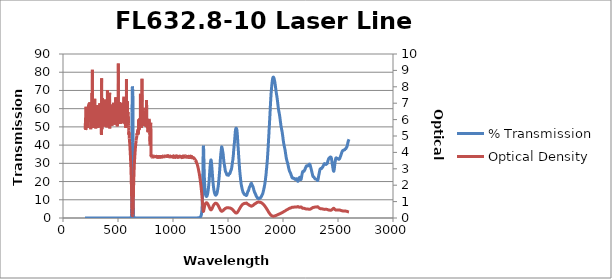
| Category | % Transmission |
|---|---|
| 2600.0 | 43.196 |
| 2599.0 | 43.062 |
| 2598.0 | 42.871 |
| 2597.0 | 42.738 |
| 2596.0 | 42.614 |
| 2595.0 | 42.464 |
| 2594.0 | 42.283 |
| 2593.0 | 42.076 |
| 2592.0 | 41.834 |
| 2591.0 | 41.621 |
| 2590.0 | 41.349 |
| 2589.0 | 41.074 |
| 2588.0 | 40.827 |
| 2587.0 | 40.534 |
| 2586.0 | 40.253 |
| 2585.0 | 40 |
| 2584.0 | 39.734 |
| 2583.0 | 39.489 |
| 2582.0 | 39.278 |
| 2581.0 | 39.092 |
| 2580.0 | 38.997 |
| 2579.0 | 38.913 |
| 2578.0 | 38.8 |
| 2577.0 | 38.715 |
| 2576.0 | 38.593 |
| 2575.0 | 38.463 |
| 2574.0 | 38.34 |
| 2573.0 | 38.215 |
| 2572.0 | 38.123 |
| 2571.0 | 38.048 |
| 2570.0 | 37.995 |
| 2569.0 | 37.967 |
| 2568.0 | 37.96 |
| 2567.0 | 37.935 |
| 2566.0 | 37.918 |
| 2565.0 | 37.865 |
| 2564.0 | 37.772 |
| 2563.0 | 37.67 |
| 2562.0 | 37.567 |
| 2561.0 | 37.487 |
| 2560.0 | 37.415 |
| 2559.0 | 37.37 |
| 2558.0 | 37.332 |
| 2557.0 | 37.343 |
| 2556.0 | 37.321 |
| 2555.0 | 37.329 |
| 2554.0 | 37.312 |
| 2553.0 | 37.299 |
| 2552.0 | 37.284 |
| 2551.0 | 37.246 |
| 2550.0 | 37.211 |
| 2549.0 | 37.189 |
| 2548.0 | 37.184 |
| 2547.0 | 37.151 |
| 2546.0 | 37.129 |
| 2545.0 | 37.092 |
| 2544.0 | 37.058 |
| 2543.0 | 36.993 |
| 2542.0 | 36.908 |
| 2541.0 | 36.813 |
| 2540.0 | 36.694 |
| 2539.0 | 36.596 |
| 2538.0 | 36.502 |
| 2537.0 | 36.373 |
| 2536.0 | 36.249 |
| 2535.0 | 36.068 |
| 2534.0 | 35.871 |
| 2533.0 | 35.688 |
| 2532.0 | 35.474 |
| 2531.0 | 35.268 |
| 2530.0 | 35.095 |
| 2529.0 | 34.899 |
| 2528.0 | 34.746 |
| 2527.0 | 34.568 |
| 2526.0 | 34.393 |
| 2525.0 | 34.243 |
| 2524.0 | 34.048 |
| 2523.0 | 33.882 |
| 2522.0 | 33.734 |
| 2521.0 | 33.534 |
| 2520.0 | 33.408 |
| 2519.0 | 33.234 |
| 2518.0 | 33.073 |
| 2517.0 | 32.934 |
| 2516.0 | 32.772 |
| 2515.0 | 32.644 |
| 2514.0 | 32.543 |
| 2513.0 | 32.422 |
| 2512.0 | 32.371 |
| 2511.0 | 32.304 |
| 2510.0 | 32.247 |
| 2509.0 | 32.237 |
| 2508.0 | 32.19 |
| 2507.0 | 32.21 |
| 2506.0 | 32.218 |
| 2505.0 | 32.236 |
| 2504.0 | 32.28 |
| 2503.0 | 32.328 |
| 2502.0 | 32.359 |
| 2501.0 | 32.434 |
| 2500.0 | 32.435 |
| 2499.0 | 32.491 |
| 2498.0 | 32.507 |
| 2497.0 | 32.533 |
| 2496.0 | 32.578 |
| 2495.0 | 32.613 |
| 2494.0 | 32.654 |
| 2493.0 | 32.691 |
| 2492.0 | 32.719 |
| 2491.0 | 32.747 |
| 2490.0 | 32.769 |
| 2489.0 | 32.781 |
| 2488.0 | 32.837 |
| 2487.0 | 32.855 |
| 2486.0 | 32.926 |
| 2485.0 | 32.957 |
| 2484.0 | 33.014 |
| 2483.0 | 33.01 |
| 2482.0 | 32.996 |
| 2481.0 | 32.885 |
| 2480.0 | 32.754 |
| 2479.0 | 32.525 |
| 2478.0 | 32.274 |
| 2477.0 | 31.943 |
| 2476.0 | 31.597 |
| 2475.0 | 31.193 |
| 2474.0 | 30.804 |
| 2473.0 | 30.342 |
| 2472.0 | 29.88 |
| 2471.0 | 29.401 |
| 2470.0 | 28.882 |
| 2469.0 | 28.362 |
| 2468.0 | 27.849 |
| 2467.0 | 27.336 |
| 2466.0 | 26.858 |
| 2465.0 | 26.414 |
| 2464.0 | 26.071 |
| 2463.0 | 25.813 |
| 2462.0 | 25.662 |
| 2461.0 | 25.64 |
| 2460.0 | 25.669 |
| 2459.0 | 25.833 |
| 2458.0 | 26.017 |
| 2457.0 | 26.288 |
| 2456.0 | 26.597 |
| 2455.0 | 26.916 |
| 2454.0 | 27.277 |
| 2453.0 | 27.662 |
| 2452.0 | 28.039 |
| 2451.0 | 28.485 |
| 2450.0 | 28.875 |
| 2449.0 | 29.315 |
| 2448.0 | 29.702 |
| 2447.0 | 30.103 |
| 2446.0 | 30.534 |
| 2445.0 | 30.915 |
| 2444.0 | 31.353 |
| 2443.0 | 31.757 |
| 2442.0 | 32.106 |
| 2441.0 | 32.478 |
| 2440.0 | 32.734 |
| 2439.0 | 33.008 |
| 2438.0 | 33.171 |
| 2437.0 | 33.288 |
| 2436.0 | 33.381 |
| 2435.0 | 33.381 |
| 2434.0 | 33.423 |
| 2433.0 | 33.407 |
| 2432.0 | 33.399 |
| 2431.0 | 33.435 |
| 2430.0 | 33.399 |
| 2429.0 | 33.436 |
| 2428.0 | 33.389 |
| 2427.0 | 33.337 |
| 2426.0 | 33.292 |
| 2425.0 | 33.157 |
| 2424.0 | 33.112 |
| 2423.0 | 33.009 |
| 2422.0 | 32.968 |
| 2421.0 | 32.957 |
| 2420.0 | 32.899 |
| 2419.0 | 32.913 |
| 2418.0 | 32.832 |
| 2417.0 | 32.769 |
| 2416.0 | 32.671 |
| 2415.0 | 32.508 |
| 2414.0 | 32.391 |
| 2413.0 | 32.201 |
| 2412.0 | 32.061 |
| 2411.0 | 31.887 |
| 2410.0 | 31.697 |
| 2409.0 | 31.536 |
| 2408.0 | 31.283 |
| 2407.0 | 31.071 |
| 2406.0 | 30.8 |
| 2405.0 | 30.542 |
| 2404.0 | 30.321 |
| 2403.0 | 30.097 |
| 2402.0 | 29.972 |
| 2401.0 | 29.843 |
| 2400.0 | 29.788 |
| 2399.0 | 29.755 |
| 2398.0 | 29.719 |
| 2397.0 | 29.706 |
| 2396.0 | 29.641 |
| 2395.0 | 29.604 |
| 2394.0 | 29.52 |
| 2393.0 | 29.452 |
| 2392.0 | 29.416 |
| 2391.0 | 29.38 |
| 2390.0 | 29.417 |
| 2389.0 | 29.428 |
| 2388.0 | 29.49 |
| 2387.0 | 29.517 |
| 2386.0 | 29.56 |
| 2385.0 | 29.581 |
| 2384.0 | 29.592 |
| 2383.0 | 29.625 |
| 2382.0 | 29.669 |
| 2381.0 | 29.701 |
| 2380.0 | 29.787 |
| 2379.0 | 29.805 |
| 2378.0 | 29.863 |
| 2377.0 | 29.821 |
| 2376.0 | 29.809 |
| 2375.0 | 29.698 |
| 2374.0 | 29.609 |
| 2373.0 | 29.476 |
| 2372.0 | 29.351 |
| 2371.0 | 29.244 |
| 2370.0 | 29.128 |
| 2369.0 | 29.036 |
| 2368.0 | 28.912 |
| 2367.0 | 28.8 |
| 2366.0 | 28.637 |
| 2365.0 | 28.501 |
| 2364.0 | 28.335 |
| 2363.0 | 28.212 |
| 2362.0 | 28.076 |
| 2361.0 | 28.018 |
| 2360.0 | 27.921 |
| 2359.0 | 27.912 |
| 2358.0 | 27.835 |
| 2357.0 | 27.807 |
| 2356.0 | 27.693 |
| 2355.0 | 27.605 |
| 2354.0 | 27.458 |
| 2353.0 | 27.33 |
| 2352.0 | 27.233 |
| 2351.0 | 27.151 |
| 2350.0 | 27.147 |
| 2349.0 | 27.13 |
| 2348.0 | 27.199 |
| 2347.0 | 27.201 |
| 2346.0 | 27.257 |
| 2345.0 | 27.223 |
| 2344.0 | 27.23 |
| 2343.0 | 27.173 |
| 2342.0 | 27.14 |
| 2341.0 | 27.094 |
| 2340.0 | 27.034 |
| 2339.0 | 26.979 |
| 2338.0 | 26.864 |
| 2337.0 | 26.74 |
| 2336.0 | 26.536 |
| 2335.0 | 26.309 |
| 2334.0 | 26.009 |
| 2333.0 | 25.711 |
| 2332.0 | 25.406 |
| 2331.0 | 25.111 |
| 2330.0 | 24.824 |
| 2329.0 | 24.562 |
| 2328.0 | 24.274 |
| 2327.0 | 23.987 |
| 2326.0 | 23.677 |
| 2325.0 | 23.348 |
| 2324.0 | 22.983 |
| 2323.0 | 22.636 |
| 2322.0 | 22.263 |
| 2321.0 | 21.916 |
| 2320.0 | 21.59 |
| 2319.0 | 21.297 |
| 2318.0 | 21.052 |
| 2317.0 | 20.821 |
| 2316.0 | 20.683 |
| 2315.0 | 20.557 |
| 2314.0 | 20.542 |
| 2313.0 | 20.569 |
| 2312.0 | 20.658 |
| 2311.0 | 20.79 |
| 2310.0 | 20.919 |
| 2309.0 | 21.066 |
| 2308.0 | 21.164 |
| 2307.0 | 21.247 |
| 2306.0 | 21.28 |
| 2305.0 | 21.297 |
| 2304.0 | 21.307 |
| 2303.0 | 21.292 |
| 2302.0 | 21.314 |
| 2301.0 | 21.308 |
| 2300.0 | 21.325 |
| 2299.0 | 21.331 |
| 2298.0 | 21.338 |
| 2297.0 | 21.357 |
| 2296.0 | 21.355 |
| 2295.0 | 21.398 |
| 2294.0 | 21.409 |
| 2293.0 | 21.464 |
| 2292.0 | 21.498 |
| 2291.0 | 21.554 |
| 2290.0 | 21.618 |
| 2289.0 | 21.671 |
| 2288.0 | 21.757 |
| 2287.0 | 21.832 |
| 2286.0 | 21.932 |
| 2285.0 | 22.035 |
| 2284.0 | 22.14 |
| 2283.0 | 22.248 |
| 2282.0 | 22.34 |
| 2281.0 | 22.418 |
| 2280.0 | 22.478 |
| 2279.0 | 22.528 |
| 2278.0 | 22.56 |
| 2277.0 | 22.593 |
| 2276.0 | 22.622 |
| 2275.0 | 22.653 |
| 2274.0 | 22.715 |
| 2273.0 | 22.791 |
| 2272.0 | 22.926 |
| 2271.0 | 23.082 |
| 2270.0 | 23.309 |
| 2269.0 | 23.549 |
| 2268.0 | 23.804 |
| 2267.0 | 24.076 |
| 2266.0 | 24.323 |
| 2265.0 | 24.592 |
| 2264.0 | 24.837 |
| 2263.0 | 25.114 |
| 2262.0 | 25.366 |
| 2261.0 | 25.626 |
| 2260.0 | 25.869 |
| 2259.0 | 26.122 |
| 2258.0 | 26.363 |
| 2257.0 | 26.611 |
| 2256.0 | 26.864 |
| 2255.0 | 27.109 |
| 2254.0 | 27.366 |
| 2253.0 | 27.623 |
| 2252.0 | 27.87 |
| 2251.0 | 28.135 |
| 2250.0 | 28.373 |
| 2249.0 | 28.607 |
| 2248.0 | 28.799 |
| 2247.0 | 28.995 |
| 2246.0 | 29.149 |
| 2245.0 | 29.287 |
| 2244.0 | 29.401 |
| 2243.0 | 29.488 |
| 2242.0 | 29.549 |
| 2241.0 | 29.575 |
| 2240.0 | 29.576 |
| 2239.0 | 29.542 |
| 2238.0 | 29.497 |
| 2237.0 | 29.4 |
| 2236.0 | 29.324 |
| 2235.0 | 29.195 |
| 2234.0 | 29.111 |
| 2233.0 | 28.984 |
| 2232.0 | 28.919 |
| 2231.0 | 28.828 |
| 2230.0 | 28.786 |
| 2229.0 | 28.725 |
| 2228.0 | 28.691 |
| 2227.0 | 28.634 |
| 2226.0 | 28.622 |
| 2225.0 | 28.593 |
| 2224.0 | 28.625 |
| 2223.0 | 28.647 |
| 2222.0 | 28.686 |
| 2221.0 | 28.726 |
| 2220.0 | 28.71 |
| 2219.0 | 28.723 |
| 2218.0 | 28.665 |
| 2217.0 | 28.654 |
| 2216.0 | 28.621 |
| 2215.0 | 28.612 |
| 2214.0 | 28.59 |
| 2213.0 | 28.571 |
| 2212.0 | 28.479 |
| 2211.0 | 28.406 |
| 2210.0 | 28.23 |
| 2209.0 | 28.116 |
| 2208.0 | 27.927 |
| 2207.0 | 27.82 |
| 2206.0 | 27.685 |
| 2205.0 | 27.58 |
| 2204.0 | 27.443 |
| 2203.0 | 27.297 |
| 2202.0 | 27.085 |
| 2201.0 | 26.897 |
| 2200.0 | 26.669 |
| 2199.0 | 26.538 |
| 2198.0 | 26.413 |
| 2197.0 | 26.357 |
| 2196.0 | 26.292 |
| 2195.0 | 26.189 |
| 2194.0 | 26.062 |
| 2193.0 | 25.908 |
| 2192.0 | 25.749 |
| 2191.0 | 25.696 |
| 2190.0 | 25.654 |
| 2189.0 | 25.709 |
| 2188.0 | 25.762 |
| 2187.0 | 25.785 |
| 2186.0 | 25.786 |
| 2185.0 | 25.736 |
| 2184.0 | 25.668 |
| 2183.0 | 25.643 |
| 2182.0 | 25.58 |
| 2181.0 | 25.569 |
| 2180.0 | 25.502 |
| 2179.0 | 25.407 |
| 2178.0 | 25.252 |
| 2177.0 | 25.058 |
| 2176.0 | 24.812 |
| 2175.0 | 24.565 |
| 2174.0 | 24.279 |
| 2173.0 | 23.999 |
| 2172.0 | 23.684 |
| 2171.0 | 23.356 |
| 2170.0 | 22.988 |
| 2169.0 | 22.603 |
| 2168.0 | 22.216 |
| 2167.0 | 21.86 |
| 2166.0 | 21.539 |
| 2165.0 | 21.339 |
| 2164.0 | 21.18 |
| 2163.0 | 21.123 |
| 2162.0 | 21.094 |
| 2161.0 | 21.147 |
| 2160.0 | 21.216 |
| 2159.0 | 21.37 |
| 2158.0 | 21.515 |
| 2157.0 | 21.732 |
| 2156.0 | 21.894 |
| 2155.0 | 22.086 |
| 2154.0 | 22.183 |
| 2153.0 | 22.291 |
| 2152.0 | 22.287 |
| 2151.0 | 22.322 |
| 2150.0 | 22.255 |
| 2149.0 | 22.241 |
| 2148.0 | 22.12 |
| 2147.0 | 22.041 |
| 2146.0 | 21.848 |
| 2145.0 | 21.685 |
| 2144.0 | 21.424 |
| 2143.0 | 21.216 |
| 2142.0 | 20.965 |
| 2141.0 | 20.78 |
| 2140.0 | 20.583 |
| 2139.0 | 20.467 |
| 2138.0 | 20.298 |
| 2137.0 | 20.208 |
| 2136.0 | 20.117 |
| 2135.0 | 20.124 |
| 2134.0 | 20.193 |
| 2133.0 | 20.333 |
| 2132.0 | 20.518 |
| 2131.0 | 20.718 |
| 2130.0 | 20.899 |
| 2129.0 | 21.045 |
| 2128.0 | 21.2 |
| 2127.0 | 21.283 |
| 2126.0 | 21.418 |
| 2125.0 | 21.462 |
| 2124.0 | 21.562 |
| 2123.0 | 21.546 |
| 2122.0 | 21.574 |
| 2121.0 | 21.484 |
| 2120.0 | 21.467 |
| 2119.0 | 21.38 |
| 2118.0 | 21.372 |
| 2117.0 | 21.332 |
| 2116.0 | 21.349 |
| 2115.0 | 21.304 |
| 2114.0 | 21.281 |
| 2113.0 | 21.219 |
| 2112.0 | 21.167 |
| 2111.0 | 21.159 |
| 2110.0 | 21.164 |
| 2109.0 | 21.249 |
| 2108.0 | 21.29 |
| 2107.0 | 21.371 |
| 2106.0 | 21.366 |
| 2105.0 | 21.431 |
| 2104.0 | 21.424 |
| 2103.0 | 21.526 |
| 2102.0 | 21.592 |
| 2101.0 | 21.712 |
| 2100.0 | 21.758 |
| 2099.0 | 21.825 |
| 2098.0 | 21.828 |
| 2097.0 | 21.823 |
| 2096.0 | 21.853 |
| 2095.0 | 21.843 |
| 2094.0 | 21.917 |
| 2093.0 | 21.914 |
| 2092.0 | 21.972 |
| 2091.0 | 21.917 |
| 2090.0 | 21.926 |
| 2089.0 | 21.868 |
| 2088.0 | 21.884 |
| 2087.0 | 21.926 |
| 2086.0 | 22.007 |
| 2085.0 | 22.091 |
| 2084.0 | 22.157 |
| 2083.0 | 22.235 |
| 2082.0 | 22.263 |
| 2081.0 | 22.401 |
| 2080.0 | 22.522 |
| 2079.0 | 22.754 |
| 2078.0 | 22.918 |
| 2077.0 | 23.148 |
| 2076.0 | 23.286 |
| 2075.0 | 23.429 |
| 2074.0 | 23.6 |
| 2073.0 | 23.75 |
| 2072.0 | 23.995 |
| 2071.0 | 24.162 |
| 2070.0 | 24.401 |
| 2069.0 | 24.5 |
| 2068.0 | 24.647 |
| 2067.0 | 24.717 |
| 2066.0 | 24.827 |
| 2065.0 | 24.97 |
| 2064.0 | 25.109 |
| 2063.0 | 25.296 |
| 2062.0 | 25.391 |
| 2061.0 | 25.536 |
| 2060.0 | 25.587 |
| 2059.0 | 25.736 |
| 2058.0 | 25.905 |
| 2057.0 | 26.137 |
| 2056.0 | 26.395 |
| 2055.0 | 26.623 |
| 2054.0 | 26.859 |
| 2053.0 | 27.026 |
| 2052.0 | 27.295 |
| 2051.0 | 27.549 |
| 2050.0 | 27.904 |
| 2049.0 | 28.221 |
| 2048.0 | 28.548 |
| 2047.0 | 28.822 |
| 2046.0 | 29.024 |
| 2045.0 | 29.308 |
| 2044.0 | 29.52 |
| 2043.0 | 29.818 |
| 2042.0 | 30.071 |
| 2041.0 | 30.336 |
| 2040.0 | 30.542 |
| 2039.0 | 30.686 |
| 2038.0 | 30.894 |
| 2037.0 | 31.032 |
| 2036.0 | 31.293 |
| 2035.0 | 31.54 |
| 2034.0 | 31.841 |
| 2033.0 | 32.082 |
| 2032.0 | 32.298 |
| 2031.0 | 32.584 |
| 2030.0 | 32.816 |
| 2029.0 | 33.208 |
| 2028.0 | 33.599 |
| 2027.0 | 34.037 |
| 2026.0 | 34.427 |
| 2025.0 | 34.773 |
| 2024.0 | 35.197 |
| 2023.0 | 35.516 |
| 2022.0 | 35.988 |
| 2021.0 | 36.409 |
| 2020.0 | 36.852 |
| 2019.0 | 37.226 |
| 2018.0 | 37.511 |
| 2017.0 | 37.835 |
| 2016.0 | 38.074 |
| 2015.0 | 38.393 |
| 2014.0 | 38.714 |
| 2013.0 | 39.024 |
| 2012.0 | 39.338 |
| 2011.0 | 39.526 |
| 2010.0 | 39.797 |
| 2009.0 | 40.044 |
| 2008.0 | 40.365 |
| 2007.0 | 40.767 |
| 2006.0 | 41.176 |
| 2005.0 | 41.609 |
| 2004.0 | 41.93 |
| 2003.0 | 42.333 |
| 2002.0 | 42.797 |
| 2001.0 | 43.263 |
| 2000.0 | 43.85 |
| 1999.0 | 44.327 |
| 1998.0 | 44.842 |
| 1997.0 | 45.228 |
| 1996.0 | 45.615 |
| 1995.0 | 46.07 |
| 1994.0 | 46.487 |
| 1993.0 | 46.952 |
| 1992.0 | 47.317 |
| 1991.0 | 47.645 |
| 1990.0 | 47.949 |
| 1989.0 | 48.158 |
| 1988.0 | 48.456 |
| 1987.0 | 48.803 |
| 1986.0 | 49.146 |
| 1985.0 | 49.481 |
| 1984.0 | 49.744 |
| 1983.0 | 50.068 |
| 1982.0 | 50.374 |
| 1981.0 | 50.77 |
| 1980.0 | 51.273 |
| 1979.0 | 51.774 |
| 1978.0 | 52.254 |
| 1977.0 | 52.682 |
| 1976.0 | 53.102 |
| 1975.0 | 53.605 |
| 1974.0 | 54.11 |
| 1973.0 | 54.637 |
| 1972.0 | 55.109 |
| 1971.0 | 55.529 |
| 1970.0 | 55.947 |
| 1969.0 | 56.246 |
| 1968.0 | 56.621 |
| 1967.0 | 57.015 |
| 1966.0 | 57.36 |
| 1965.0 | 57.714 |
| 1964.0 | 57.989 |
| 1963.0 | 58.282 |
| 1962.0 | 58.602 |
| 1961.0 | 58.93 |
| 1960.0 | 59.355 |
| 1959.0 | 59.774 |
| 1958.0 | 60.219 |
| 1957.0 | 60.659 |
| 1956.0 | 61.047 |
| 1955.0 | 61.54 |
| 1954.0 | 62.088 |
| 1953.0 | 62.621 |
| 1952.0 | 63.169 |
| 1951.0 | 63.66 |
| 1950.0 | 64.147 |
| 1949.0 | 64.641 |
| 1948.0 | 65.112 |
| 1947.0 | 65.58 |
| 1946.0 | 66.026 |
| 1945.0 | 66.444 |
| 1944.0 | 66.867 |
| 1943.0 | 67.21 |
| 1942.0 | 67.58 |
| 1941.0 | 67.956 |
| 1940.0 | 68.327 |
| 1939.0 | 68.747 |
| 1938.0 | 69.16 |
| 1937.0 | 69.582 |
| 1936.0 | 70.029 |
| 1935.0 | 70.479 |
| 1934.0 | 70.932 |
| 1933.0 | 71.402 |
| 1932.0 | 71.887 |
| 1931.0 | 72.374 |
| 1930.0 | 72.849 |
| 1929.0 | 73.3 |
| 1928.0 | 73.742 |
| 1927.0 | 74.136 |
| 1926.0 | 74.496 |
| 1925.0 | 74.834 |
| 1924.0 | 75.159 |
| 1923.0 | 75.459 |
| 1922.0 | 75.736 |
| 1921.0 | 75.988 |
| 1920.0 | 76.252 |
| 1919.0 | 76.496 |
| 1918.0 | 76.682 |
| 1917.0 | 76.834 |
| 1916.0 | 76.979 |
| 1915.0 | 77.112 |
| 1914.0 | 77.215 |
| 1913.0 | 77.29 |
| 1912.0 | 77.328 |
| 1911.0 | 77.307 |
| 1910.0 | 77.242 |
| 1909.0 | 77.135 |
| 1908.0 | 76.994 |
| 1907.0 | 76.804 |
| 1906.0 | 76.517 |
| 1905.0 | 76.167 |
| 1904.0 | 75.742 |
| 1903.0 | 75.308 |
| 1902.0 | 74.887 |
| 1901.0 | 74.414 |
| 1900.0 | 73.891 |
| 1899.0 | 73.278 |
| 1898.0 | 72.643 |
| 1897.0 | 72.018 |
| 1896.0 | 71.401 |
| 1895.0 | 70.761 |
| 1894.0 | 70.055 |
| 1893.0 | 69.253 |
| 1892.0 | 68.438 |
| 1891.0 | 67.544 |
| 1890.0 | 66.539 |
| 1889.0 | 65.483 |
| 1888.0 | 64.498 |
| 1887.0 | 63.431 |
| 1886.0 | 62.359 |
| 1885.0 | 61.21 |
| 1884.0 | 59.917 |
| 1883.0 | 58.625 |
| 1882.0 | 57.458 |
| 1881.0 | 56.333 |
| 1880.0 | 55.178 |
| 1879.0 | 54.113 |
| 1878.0 | 52.952 |
| 1877.0 | 51.778 |
| 1876.0 | 50.749 |
| 1875.0 | 49.808 |
| 1874.0 | 48.698 |
| 1873.0 | 47.557 |
| 1872.0 | 46.346 |
| 1871.0 | 45.164 |
| 1870.0 | 44.243 |
| 1869.0 | 43.335 |
| 1868.0 | 42.21 |
| 1867.0 | 41.06 |
| 1866.0 | 39.948 |
| 1865.0 | 38.811 |
| 1864.0 | 37.749 |
| 1863.0 | 36.765 |
| 1862.0 | 35.903 |
| 1861.0 | 35.054 |
| 1860.0 | 34.094 |
| 1859.0 | 33.066 |
| 1858.0 | 32.153 |
| 1857.0 | 31.451 |
| 1856.0 | 30.755 |
| 1855.0 | 30.052 |
| 1854.0 | 29.342 |
| 1853.0 | 28.579 |
| 1852.0 | 27.823 |
| 1851.0 | 27.254 |
| 1850.0 | 26.8 |
| 1849.0 | 26.211 |
| 1848.0 | 25.47 |
| 1847.0 | 24.691 |
| 1846.0 | 23.965 |
| 1845.0 | 23.436 |
| 1844.0 | 23.027 |
| 1843.0 | 22.583 |
| 1842.0 | 22.041 |
| 1841.0 | 21.503 |
| 1840.0 | 20.91 |
| 1839.0 | 20.377 |
| 1838.0 | 19.998 |
| 1837.0 | 19.673 |
| 1836.0 | 19.254 |
| 1835.0 | 18.791 |
| 1834.0 | 18.414 |
| 1833.0 | 18.064 |
| 1832.0 | 17.717 |
| 1831.0 | 17.401 |
| 1830.0 | 17.095 |
| 1829.0 | 16.769 |
| 1828.0 | 16.503 |
| 1827.0 | 16.264 |
| 1826.0 | 16.018 |
| 1825.0 | 15.705 |
| 1824.0 | 15.377 |
| 1823.0 | 15.052 |
| 1822.0 | 14.824 |
| 1821.0 | 14.648 |
| 1820.0 | 14.435 |
| 1819.0 | 14.136 |
| 1818.0 | 13.844 |
| 1817.0 | 13.607 |
| 1816.0 | 13.438 |
| 1815.0 | 13.312 |
| 1814.0 | 13.2 |
| 1813.0 | 13.029 |
| 1812.0 | 12.87 |
| 1811.0 | 12.741 |
| 1810.0 | 12.655 |
| 1809.0 | 12.549 |
| 1808.0 | 12.423 |
| 1807.0 | 12.26 |
| 1806.0 | 12.077 |
| 1805.0 | 11.951 |
| 1804.0 | 11.873 |
| 1803.0 | 11.807 |
| 1802.0 | 11.676 |
| 1801.0 | 11.525 |
| 1800.0 | 11.396 |
| 1799.0 | 11.317 |
| 1798.0 | 11.275 |
| 1797.0 | 11.23 |
| 1796.0 | 11.146 |
| 1795.0 | 11.031 |
| 1794.0 | 10.988 |
| 1793.0 | 11.011 |
| 1792.0 | 11.025 |
| 1791.0 | 10.97 |
| 1790.0 | 10.905 |
| 1789.0 | 10.862 |
| 1788.0 | 10.849 |
| 1787.0 | 10.855 |
| 1786.0 | 10.849 |
| 1785.0 | 10.802 |
| 1784.0 | 10.712 |
| 1783.0 | 10.665 |
| 1782.0 | 10.687 |
| 1781.0 | 10.719 |
| 1780.0 | 10.678 |
| 1779.0 | 10.599 |
| 1778.0 | 10.58 |
| 1777.0 | 10.63 |
| 1776.0 | 10.692 |
| 1775.0 | 10.724 |
| 1774.0 | 10.735 |
| 1773.0 | 10.737 |
| 1772.0 | 10.776 |
| 1771.0 | 10.881 |
| 1770.0 | 10.99 |
| 1769.0 | 11.041 |
| 1768.0 | 11.03 |
| 1767.0 | 11.069 |
| 1766.0 | 11.203 |
| 1765.0 | 11.347 |
| 1764.0 | 11.403 |
| 1763.0 | 11.394 |
| 1762.0 | 11.445 |
| 1761.0 | 11.586 |
| 1760.0 | 11.748 |
| 1759.0 | 11.857 |
| 1758.0 | 11.924 |
| 1757.0 | 12.01 |
| 1756.0 | 12.164 |
| 1755.0 | 12.372 |
| 1754.0 | 12.566 |
| 1753.0 | 12.703 |
| 1752.0 | 12.784 |
| 1751.0 | 12.898 |
| 1750.0 | 13.126 |
| 1749.0 | 13.358 |
| 1748.0 | 13.496 |
| 1747.0 | 13.511 |
| 1746.0 | 13.567 |
| 1745.0 | 13.753 |
| 1744.0 | 13.979 |
| 1743.0 | 14.094 |
| 1742.0 | 14.07 |
| 1741.0 | 14.128 |
| 1740.0 | 14.358 |
| 1739.0 | 14.655 |
| 1738.0 | 14.839 |
| 1737.0 | 14.908 |
| 1736.0 | 15.06 |
| 1735.0 | 15.373 |
| 1734.0 | 15.74 |
| 1733.0 | 15.993 |
| 1732.0 | 16.119 |
| 1731.0 | 16.284 |
| 1730.0 | 16.559 |
| 1729.0 | 16.884 |
| 1728.0 | 17.082 |
| 1727.0 | 17.132 |
| 1726.0 | 17.182 |
| 1725.0 | 17.309 |
| 1724.0 | 17.552 |
| 1723.0 | 17.718 |
| 1722.0 | 17.745 |
| 1721.0 | 17.775 |
| 1720.0 | 17.916 |
| 1719.0 | 18.189 |
| 1718.0 | 18.419 |
| 1717.0 | 18.506 |
| 1716.0 | 18.565 |
| 1715.0 | 18.694 |
| 1714.0 | 18.928 |
| 1713.0 | 19.065 |
| 1712.0 | 19.039 |
| 1711.0 | 18.925 |
| 1710.0 | 18.863 |
| 1709.0 | 18.878 |
| 1708.0 | 18.82 |
| 1707.0 | 18.601 |
| 1706.0 | 18.346 |
| 1705.0 | 18.15 |
| 1704.0 | 18.089 |
| 1703.0 | 17.966 |
| 1702.0 | 17.7 |
| 1701.0 | 17.447 |
| 1700.0 | 17.323 |
| 1699.0 | 17.336 |
| 1698.0 | 17.296 |
| 1697.0 | 17.1 |
| 1696.0 | 16.924 |
| 1695.0 | 16.839 |
| 1694.0 | 16.808 |
| 1693.0 | 16.666 |
| 1692.0 | 16.33 |
| 1691.0 | 15.969 |
| 1690.0 | 15.749 |
| 1689.0 | 15.648 |
| 1688.0 | 15.509 |
| 1687.0 | 15.237 |
| 1686.0 | 14.97 |
| 1685.0 | 14.872 |
| 1684.0 | 14.904 |
| 1683.0 | 14.886 |
| 1682.0 | 14.726 |
| 1681.0 | 14.519 |
| 1680.0 | 14.404 |
| 1679.0 | 14.337 |
| 1678.0 | 14.196 |
| 1677.0 | 13.967 |
| 1676.0 | 13.678 |
| 1675.0 | 13.464 |
| 1674.0 | 13.284 |
| 1673.0 | 13.073 |
| 1672.0 | 12.827 |
| 1671.0 | 12.631 |
| 1670.0 | 12.54 |
| 1669.0 | 12.492 |
| 1668.0 | 12.406 |
| 1667.0 | 12.321 |
| 1666.0 | 12.341 |
| 1665.0 | 12.473 |
| 1664.0 | 12.608 |
| 1663.0 | 12.647 |
| 1662.0 | 12.63 |
| 1661.0 | 12.657 |
| 1660.0 | 12.749 |
| 1659.0 | 12.82 |
| 1658.0 | 12.844 |
| 1657.0 | 12.813 |
| 1656.0 | 12.809 |
| 1655.0 | 12.835 |
| 1654.0 | 12.832 |
| 1653.0 | 12.797 |
| 1652.0 | 12.785 |
| 1651.0 | 12.855 |
| 1650.0 | 12.96 |
| 1649.0 | 13.023 |
| 1648.0 | 13.026 |
| 1647.0 | 13.063 |
| 1646.0 | 13.17 |
| 1645.0 | 13.308 |
| 1644.0 | 13.424 |
| 1643.0 | 13.513 |
| 1642.0 | 13.622 |
| 1641.0 | 13.766 |
| 1640.0 | 13.889 |
| 1639.0 | 13.941 |
| 1638.0 | 13.996 |
| 1637.0 | 14.131 |
| 1636.0 | 14.333 |
| 1635.0 | 14.529 |
| 1634.0 | 14.692 |
| 1633.0 | 14.877 |
| 1632.0 | 15.119 |
| 1631.0 | 15.385 |
| 1630.0 | 15.606 |
| 1629.0 | 15.815 |
| 1628.0 | 16.083 |
| 1627.0 | 16.398 |
| 1626.0 | 16.707 |
| 1625.0 | 16.976 |
| 1624.0 | 17.237 |
| 1623.0 | 17.548 |
| 1622.0 | 17.921 |
| 1621.0 | 18.272 |
| 1620.0 | 18.565 |
| 1619.0 | 18.927 |
| 1618.0 | 19.399 |
| 1617.0 | 19.924 |
| 1616.0 | 20.42 |
| 1615.0 | 20.933 |
| 1614.0 | 21.512 |
| 1613.0 | 22.119 |
| 1612.0 | 22.707 |
| 1611.0 | 23.229 |
| 1610.0 | 23.763 |
| 1609.0 | 24.402 |
| 1608.0 | 25.094 |
| 1607.0 | 25.738 |
| 1606.0 | 26.351 |
| 1605.0 | 27.075 |
| 1604.0 | 27.935 |
| 1603.0 | 28.826 |
| 1602.0 | 29.68 |
| 1601.0 | 30.531 |
| 1600.0 | 31.498 |
| 1599.0 | 32.504 |
| 1598.0 | 33.444 |
| 1597.0 | 34.277 |
| 1596.0 | 35.196 |
| 1595.0 | 36.221 |
| 1594.0 | 37.165 |
| 1593.0 | 38.018 |
| 1592.0 | 38.814 |
| 1591.0 | 39.766 |
| 1590.0 | 40.853 |
| 1589.0 | 41.846 |
| 1588.0 | 42.702 |
| 1587.0 | 43.609 |
| 1586.0 | 44.695 |
| 1585.0 | 45.685 |
| 1584.0 | 46.398 |
| 1583.0 | 47.017 |
| 1582.0 | 47.706 |
| 1581.0 | 48.327 |
| 1580.0 | 48.635 |
| 1579.0 | 48.716 |
| 1578.0 | 48.855 |
| 1577.0 | 49.146 |
| 1576.0 | 49.247 |
| 1575.0 | 49.102 |
| 1574.0 | 49.056 |
| 1573.0 | 49.22 |
| 1572.0 | 49.277 |
| 1571.0 | 49.032 |
| 1570.0 | 48.687 |
| 1569.0 | 48.497 |
| 1568.0 | 48.241 |
| 1567.0 | 47.621 |
| 1566.0 | 46.795 |
| 1565.0 | 46.133 |
| 1564.0 | 45.555 |
| 1563.0 | 44.747 |
| 1562.0 | 43.777 |
| 1561.0 | 43.027 |
| 1560.0 | 42.549 |
| 1559.0 | 41.957 |
| 1558.0 | 41.123 |
| 1557.0 | 40.437 |
| 1556.0 | 40.008 |
| 1555.0 | 39.456 |
| 1554.0 | 38.635 |
| 1553.0 | 37.796 |
| 1552.0 | 37.178 |
| 1551.0 | 36.541 |
| 1550.0 | 35.649 |
| 1549.0 | 34.758 |
| 1548.0 | 34.125 |
| 1547.0 | 33.656 |
| 1546.0 | 33.026 |
| 1545.0 | 32.317 |
| 1544.0 | 31.893 |
| 1543.0 | 31.644 |
| 1542.0 | 31.236 |
| 1541.0 | 30.685 |
| 1540.0 | 30.287 |
| 1539.0 | 30.02 |
| 1538.0 | 29.6 |
| 1537.0 | 29.004 |
| 1536.0 | 28.499 |
| 1535.0 | 28.209 |
| 1534.0 | 27.87 |
| 1533.0 | 27.392 |
| 1532.0 | 26.988 |
| 1531.0 | 26.865 |
| 1530.0 | 26.754 |
| 1529.0 | 26.468 |
| 1528.0 | 26.239 |
| 1527.0 | 26.215 |
| 1526.0 | 26.169 |
| 1525.0 | 25.904 |
| 1524.0 | 25.606 |
| 1523.0 | 25.481 |
| 1522.0 | 25.378 |
| 1521.0 | 25.083 |
| 1520.0 | 24.75 |
| 1519.0 | 24.647 |
| 1518.0 | 24.644 |
| 1517.0 | 24.481 |
| 1516.0 | 24.295 |
| 1515.0 | 24.349 |
| 1514.0 | 24.47 |
| 1513.0 | 24.395 |
| 1512.0 | 24.246 |
| 1511.0 | 24.268 |
| 1510.0 | 24.305 |
| 1509.0 | 24.139 |
| 1508.0 | 23.886 |
| 1507.0 | 23.794 |
| 1506.0 | 23.771 |
| 1505.0 | 23.607 |
| 1504.0 | 23.431 |
| 1503.0 | 23.463 |
| 1502.0 | 23.595 |
| 1501.0 | 23.588 |
| 1500.0 | 23.56 |
| 1499.0 | 23.708 |
| 1498.0 | 23.868 |
| 1497.0 | 23.857 |
| 1496.0 | 23.78 |
| 1495.0 | 23.803 |
| 1494.0 | 23.866 |
| 1493.0 | 23.763 |
| 1492.0 | 23.626 |
| 1491.0 | 23.669 |
| 1490.0 | 23.799 |
| 1489.0 | 23.798 |
| 1488.0 | 23.824 |
| 1487.0 | 24.06 |
| 1486.0 | 24.341 |
| 1485.0 | 24.451 |
| 1484.0 | 24.574 |
| 1483.0 | 24.838 |
| 1482.0 | 25.059 |
| 1481.0 | 25.085 |
| 1480.0 | 25.124 |
| 1479.0 | 25.347 |
| 1478.0 | 25.528 |
| 1477.0 | 25.559 |
| 1476.0 | 25.736 |
| 1475.0 | 26.155 |
| 1474.0 | 26.507 |
| 1473.0 | 26.773 |
| 1472.0 | 27.259 |
| 1471.0 | 27.826 |
| 1470.0 | 28.222 |
| 1469.0 | 28.489 |
| 1468.0 | 28.942 |
| 1467.0 | 29.392 |
| 1466.0 | 29.584 |
| 1465.0 | 29.813 |
| 1464.0 | 30.299 |
| 1463.0 | 30.768 |
| 1462.0 | 31.132 |
| 1461.0 | 31.733 |
| 1460.0 | 32.529 |
| 1459.0 | 33.158 |
| 1458.0 | 33.708 |
| 1457.0 | 34.416 |
| 1456.0 | 35.076 |
| 1455.0 | 35.45 |
| 1454.0 | 35.789 |
| 1453.0 | 36.242 |
| 1452.0 | 36.555 |
| 1451.0 | 36.755 |
| 1450.0 | 37.146 |
| 1449.0 | 37.587 |
| 1448.0 | 37.841 |
| 1447.0 | 38.178 |
| 1446.0 | 38.639 |
| 1445.0 | 38.867 |
| 1444.0 | 38.913 |
| 1443.0 | 39.048 |
| 1442.0 | 39.021 |
| 1441.0 | 38.519 |
| 1440.0 | 38.046 |
| 1439.0 | 37.695 |
| 1438.0 | 37.069 |
| 1437.0 | 36.258 |
| 1436.0 | 35.808 |
| 1435.0 | 35.388 |
| 1434.0 | 34.607 |
| 1433.0 | 33.896 |
| 1432.0 | 33.344 |
| 1431.0 | 32.522 |
| 1430.0 | 31.432 |
| 1429.0 | 30.567 |
| 1428.0 | 29.75 |
| 1427.0 | 28.627 |
| 1426.0 | 27.575 |
| 1425.0 | 26.741 |
| 1424.0 | 25.876 |
| 1423.0 | 24.931 |
| 1422.0 | 24.275 |
| 1421.0 | 23.703 |
| 1420.0 | 22.948 |
| 1419.0 | 22.201 |
| 1418.0 | 21.594 |
| 1417.0 | 20.972 |
| 1416.0 | 20.252 |
| 1415.0 | 19.652 |
| 1414.0 | 19.082 |
| 1413.0 | 18.43 |
| 1412.0 | 17.881 |
| 1411.0 | 17.447 |
| 1410.0 | 17.009 |
| 1409.0 | 16.532 |
| 1408.0 | 16.217 |
| 1407.0 | 15.9 |
| 1406.0 | 15.483 |
| 1405.0 | 15.221 |
| 1404.0 | 14.891 |
| 1403.0 | 14.513 |
| 1402.0 | 14.207 |
| 1401.0 | 14.015 |
| 1400.0 | 13.738 |
| 1399.0 | 13.443 |
| 1398.0 | 13.298 |
| 1397.0 | 13.2 |
| 1396.0 | 13.074 |
| 1395.0 | 12.952 |
| 1394.0 | 12.859 |
| 1393.0 | 12.76 |
| 1392.0 | 12.696 |
| 1391.0 | 12.629 |
| 1390.0 | 12.582 |
| 1389.0 | 12.533 |
| 1388.0 | 12.507 |
| 1387.0 | 12.52 |
| 1386.0 | 12.569 |
| 1385.0 | 12.679 |
| 1384.0 | 12.743 |
| 1383.0 | 12.838 |
| 1382.0 | 13.045 |
| 1381.0 | 13.146 |
| 1380.0 | 13.264 |
| 1379.0 | 13.434 |
| 1378.0 | 13.671 |
| 1377.0 | 13.87 |
| 1376.0 | 14.078 |
| 1375.0 | 14.32 |
| 1374.0 | 14.648 |
| 1373.0 | 14.994 |
| 1372.0 | 15.428 |
| 1371.0 | 15.816 |
| 1370.0 | 16.234 |
| 1369.0 | 16.694 |
| 1368.0 | 17.145 |
| 1367.0 | 17.696 |
| 1366.0 | 18.237 |
| 1365.0 | 18.766 |
| 1364.0 | 19.43 |
| 1363.0 | 20.09 |
| 1362.0 | 20.817 |
| 1361.0 | 21.663 |
| 1360.0 | 22.444 |
| 1359.0 | 23.337 |
| 1358.0 | 24.139 |
| 1357.0 | 24.985 |
| 1356.0 | 25.785 |
| 1355.0 | 26.571 |
| 1354.0 | 27.378 |
| 1353.0 | 28.15 |
| 1352.0 | 28.917 |
| 1351.0 | 29.552 |
| 1350.0 | 30.218 |
| 1349.0 | 30.817 |
| 1348.0 | 31.283 |
| 1347.0 | 31.689 |
| 1346.0 | 31.88 |
| 1345.0 | 31.894 |
| 1344.0 | 31.807 |
| 1343.0 | 31.549 |
| 1342.0 | 31.127 |
| 1341.0 | 30.653 |
| 1340.0 | 30.085 |
| 1339.0 | 29.414 |
| 1338.0 | 28.766 |
| 1337.0 | 28.02 |
| 1336.0 | 27.182 |
| 1335.0 | 26.34 |
| 1334.0 | 25.437 |
| 1333.0 | 24.499 |
| 1332.0 | 23.579 |
| 1331.0 | 22.697 |
| 1330.0 | 21.814 |
| 1329.0 | 21.017 |
| 1328.0 | 20.23 |
| 1327.0 | 19.483 |
| 1326.0 | 18.809 |
| 1325.0 | 18.163 |
| 1324.0 | 17.543 |
| 1323.0 | 16.927 |
| 1322.0 | 16.36 |
| 1321.0 | 15.819 |
| 1320.0 | 15.316 |
| 1319.0 | 14.874 |
| 1318.0 | 14.45 |
| 1317.0 | 14.076 |
| 1316.0 | 13.752 |
| 1315.0 | 13.437 |
| 1314.0 | 13.152 |
| 1313.0 | 12.897 |
| 1312.0 | 12.663 |
| 1311.0 | 12.454 |
| 1310.0 | 12.267 |
| 1309.0 | 12.101 |
| 1308.0 | 11.976 |
| 1307.0 | 11.893 |
| 1306.0 | 11.836 |
| 1305.0 | 11.806 |
| 1304.0 | 11.805 |
| 1303.0 | 11.829 |
| 1302.0 | 11.882 |
| 1301.0 | 11.961 |
| 1300.0 | 12.064 |
| 1299.0 | 12.213 |
| 1298.0 | 12.409 |
| 1297.0 | 12.655 |
| 1296.0 | 12.956 |
| 1295.0 | 13.318 |
| 1294.0 | 13.739 |
| 1293.0 | 14.226 |
| 1292.0 | 14.797 |
| 1291.0 | 15.439 |
| 1290.0 | 16.211 |
| 1289.0 | 17.134 |
| 1288.0 | 18.171 |
| 1287.0 | 19.386 |
| 1286.0 | 20.798 |
| 1285.0 | 22.474 |
| 1284.0 | 24.34 |
| 1283.0 | 26.606 |
| 1282.0 | 29.099 |
| 1281.0 | 31.638 |
| 1280.0 | 34.379 |
| 1279.0 | 36.848 |
| 1278.0 | 38.758 |
| 1277.0 | 39.702 |
| 1276.0 | 39.248 |
| 1275.0 | 37.325 |
| 1274.0 | 34.19 |
| 1273.0 | 30.091 |
| 1272.0 | 25.814 |
| 1271.0 | 21.618 |
| 1270.0 | 17.706 |
| 1269.0 | 14.465 |
| 1268.0 | 11.824 |
| 1267.0 | 9.644 |
| 1266.0 | 7.879 |
| 1265.0 | 6.509 |
| 1264.0 | 5.352 |
| 1263.0 | 4.431 |
| 1262.0 | 3.721 |
| 1261.0 | 3.126 |
| 1260.0 | 2.649 |
| 1259.0 | 2.254 |
| 1258.0 | 1.924 |
| 1257.0 | 1.651 |
| 1256.0 | 1.422 |
| 1255.0 | 1.242 |
| 1254.0 | 1.08 |
| 1253.0 | 0.945 |
| 1252.0 | 0.832 |
| 1251.0 | 0.729 |
| 1250.0 | 0.645 |
| 1249.0 | 0.571 |
| 1248.0 | 0.51 |
| 1247.0 | 0.455 |
| 1246.0 | 0.407 |
| 1245.0 | 0.365 |
| 1244.0 | 0.33 |
| 1243.0 | 0.299 |
| 1242.0 | 0.268 |
| 1241.0 | 0.244 |
| 1240.0 | 0.224 |
| 1239.0 | 0.203 |
| 1238.0 | 0.187 |
| 1237.0 | 0.171 |
| 1236.0 | 0.156 |
| 1235.0 | 0.143 |
| 1234.0 | 0.136 |
| 1233.0 | 0.124 |
| 1232.0 | 0.114 |
| 1231.0 | 0.104 |
| 1230.0 | 0.099 |
| 1229.0 | 0.091 |
| 1228.0 | 0.085 |
| 1227.0 | 0.08 |
| 1226.0 | 0.072 |
| 1225.0 | 0.071 |
| 1224.0 | 0.065 |
| 1223.0 | 0.064 |
| 1222.0 | 0.06 |
| 1221.0 | 0.055 |
| 1220.0 | 0.053 |
| 1219.0 | 0.051 |
| 1218.0 | 0.047 |
| 1217.0 | 0.047 |
| 1216.0 | 0.044 |
| 1215.0 | 0.045 |
| 1214.0 | 0.044 |
| 1213.0 | 0.04 |
| 1212.0 | 0.038 |
| 1211.0 | 0.034 |
| 1210.0 | 0.035 |
| 1209.0 | 0.036 |
| 1208.0 | 0.033 |
| 1207.0 | 0.031 |
| 1206.0 | 0.032 |
| 1205.0 | 0.03 |
| 1204.0 | 0.03 |
| 1203.0 | 0.029 |
| 1202.0 | 0.028 |
| 1201.0 | 0.027 |
| 1200.0 | 0.029 |
| 1199.0 | 0.03 |
| 1198.0 | 0.028 |
| 1197.0 | 0.028 |
| 1196.0 | 0.023 |
| 1195.0 | 0.025 |
| 1194.0 | 0.024 |
| 1193.0 | 0.025 |
| 1192.0 | 0.023 |
| 1191.0 | 0.022 |
| 1190.0 | 0.022 |
| 1189.0 | 0.024 |
| 1188.0 | 0.021 |
| 1187.0 | 0.023 |
| 1186.0 | 0.023 |
| 1185.0 | 0.024 |
| 1184.0 | 0.021 |
| 1183.0 | 0.02 |
| 1182.0 | 0.023 |
| 1181.0 | 0.021 |
| 1180.0 | 0.02 |
| 1179.0 | 0.02 |
| 1178.0 | 0.021 |
| 1177.0 | 0.021 |
| 1176.0 | 0.02 |
| 1175.0 | 0.022 |
| 1174.0 | 0.02 |
| 1173.0 | 0.02 |
| 1172.0 | 0.022 |
| 1171.0 | 0.02 |
| 1170.0 | 0.019 |
| 1169.0 | 0.019 |
| 1168.0 | 0.021 |
| 1167.0 | 0.02 |
| 1166.0 | 0.02 |
| 1165.0 | 0.02 |
| 1164.0 | 0.022 |
| 1163.0 | 0.014 |
| 1162.0 | 0.018 |
| 1161.0 | 0.017 |
| 1160.0 | 0.017 |
| 1159.0 | 0.017 |
| 1158.0 | 0.018 |
| 1157.0 | 0.02 |
| 1156.0 | 0.02 |
| 1155.0 | 0.02 |
| 1154.0 | 0.018 |
| 1153.0 | 0.019 |
| 1152.0 | 0.019 |
| 1151.0 | 0.02 |
| 1150.0 | 0.017 |
| 1149.0 | 0.018 |
| 1148.0 | 0.018 |
| 1147.0 | 0.018 |
| 1146.0 | 0.018 |
| 1145.0 | 0.02 |
| 1144.0 | 0.02 |
| 1143.0 | 0.019 |
| 1142.0 | 0.017 |
| 1141.0 | 0.018 |
| 1140.0 | 0.018 |
| 1139.0 | 0.017 |
| 1138.0 | 0.019 |
| 1137.0 | 0.02 |
| 1136.0 | 0.019 |
| 1135.0 | 0.016 |
| 1134.0 | 0.017 |
| 1133.0 | 0.018 |
| 1132.0 | 0.02 |
| 1131.0 | 0.017 |
| 1130.0 | 0.02 |
| 1129.0 | 0.018 |
| 1128.0 | 0.016 |
| 1127.0 | 0.018 |
| 1126.0 | 0.02 |
| 1125.0 | 0.018 |
| 1124.0 | 0.018 |
| 1123.0 | 0.019 |
| 1122.0 | 0.018 |
| 1121.0 | 0.02 |
| 1120.0 | 0.018 |
| 1119.0 | 0.016 |
| 1118.0 | 0.018 |
| 1117.0 | 0.018 |
| 1116.0 | 0.018 |
| 1115.0 | 0.016 |
| 1114.0 | 0.018 |
| 1113.0 | 0.016 |
| 1112.0 | 0.018 |
| 1111.0 | 0.018 |
| 1110.0 | 0.017 |
| 1109.0 | 0.021 |
| 1108.0 | 0.02 |
| 1107.0 | 0.017 |
| 1106.0 | 0.019 |
| 1105.0 | 0.018 |
| 1104.0 | 0.019 |
| 1103.0 | 0.018 |
| 1102.0 | 0.019 |
| 1101.0 | 0.018 |
| 1100.0 | 0.017 |
| 1099.0 | 0.018 |
| 1098.0 | 0.017 |
| 1097.0 | 0.017 |
| 1096.0 | 0.017 |
| 1095.0 | 0.02 |
| 1094.0 | 0.02 |
| 1093.0 | 0.019 |
| 1092.0 | 0.018 |
| 1091.0 | 0.017 |
| 1090.0 | 0.017 |
| 1089.0 | 0.02 |
| 1088.0 | 0.018 |
| 1087.0 | 0.018 |
| 1086.0 | 0.019 |
| 1085.0 | 0.017 |
| 1084.0 | 0.018 |
| 1083.0 | 0.019 |
| 1082.0 | 0.018 |
| 1081.0 | 0.02 |
| 1080.0 | 0.021 |
| 1079.0 | 0.019 |
| 1078.0 | 0.018 |
| 1077.0 | 0.018 |
| 1076.0 | 0.017 |
| 1075.0 | 0.017 |
| 1074.0 | 0.016 |
| 1073.0 | 0.018 |
| 1072.0 | 0.017 |
| 1071.0 | 0.018 |
| 1070.0 | 0.019 |
| 1069.0 | 0.02 |
| 1068.0 | 0.021 |
| 1067.0 | 0.018 |
| 1066.0 | 0.017 |
| 1065.0 | 0.019 |
| 1064.0 | 0.019 |
| 1063.0 | 0.017 |
| 1062.0 | 0.017 |
| 1061.0 | 0.018 |
| 1060.0 | 0.017 |
| 1059.0 | 0.018 |
| 1058.0 | 0.019 |
| 1057.0 | 0.017 |
| 1056.0 | 0.018 |
| 1055.0 | 0.017 |
| 1054.0 | 0.016 |
| 1053.0 | 0.021 |
| 1052.0 | 0.018 |
| 1051.0 | 0.016 |
| 1050.0 | 0.019 |
| 1049.0 | 0.018 |
| 1048.0 | 0.018 |
| 1047.0 | 0.018 |
| 1046.0 | 0.015 |
| 1045.0 | 0.019 |
| 1044.0 | 0.02 |
| 1043.0 | 0.018 |
| 1042.0 | 0.019 |
| 1041.0 | 0.017 |
| 1040.0 | 0.017 |
| 1039.0 | 0.015 |
| 1038.0 | 0.019 |
| 1037.0 | 0.018 |
| 1036.0 | 0.018 |
| 1035.0 | 0.017 |
| 1034.0 | 0.017 |
| 1033.0 | 0.019 |
| 1032.0 | 0.021 |
| 1031.0 | 0.019 |
| 1030.0 | 0.019 |
| 1029.0 | 0.019 |
| 1028.0 | 0.017 |
| 1027.0 | 0.017 |
| 1026.0 | 0.017 |
| 1025.0 | 0.018 |
| 1024.0 | 0.017 |
| 1023.0 | 0.019 |
| 1022.0 | 0.02 |
| 1021.0 | 0.02 |
| 1020.0 | 0.018 |
| 1019.0 | 0.015 |
| 1018.0 | 0.016 |
| 1017.0 | 0.02 |
| 1016.0 | 0.018 |
| 1015.0 | 0.017 |
| 1014.0 | 0.017 |
| 1013.0 | 0.018 |
| 1012.0 | 0.018 |
| 1011.0 | 0.019 |
| 1010.0 | 0.019 |
| 1009.0 | 0.018 |
| 1008.0 | 0.018 |
| 1007.0 | 0.018 |
| 1006.0 | 0.018 |
| 1005.0 | 0.017 |
| 1004.0 | 0.016 |
| 1003.0 | 0.018 |
| 1002.0 | 0.02 |
| 1001.0 | 0.019 |
| 1000.0 | 0.018 |
| 999.0 | 0.017 |
| 998.0 | 0.018 |
| 997.0 | 0.02 |
| 996.0 | 0.014 |
| 995.0 | 0.019 |
| 994.0 | 0.019 |
| 993.0 | 0.016 |
| 992.0 | 0.017 |
| 991.0 | 0.019 |
| 990.0 | 0.018 |
| 989.0 | 0.016 |
| 988.0 | 0.017 |
| 987.0 | 0.02 |
| 986.0 | 0.017 |
| 985.0 | 0.018 |
| 984.0 | 0.017 |
| 983.0 | 0.02 |
| 982.0 | 0.015 |
| 981.0 | 0.019 |
| 980.0 | 0.017 |
| 979.0 | 0.017 |
| 978.0 | 0.018 |
| 977.0 | 0.018 |
| 976.0 | 0.019 |
| 975.0 | 0.019 |
| 974.0 | 0.019 |
| 973.0 | 0.02 |
| 972.0 | 0.018 |
| 971.0 | 0.016 |
| 970.0 | 0.017 |
| 969.0 | 0.016 |
| 968.0 | 0.019 |
| 967.0 | 0.018 |
| 966.0 | 0.018 |
| 965.0 | 0.018 |
| 964.0 | 0.019 |
| 963.0 | 0.018 |
| 962.0 | 0.016 |
| 961.0 | 0.018 |
| 960.0 | 0.016 |
| 959.0 | 0.019 |
| 958.0 | 0.018 |
| 957.0 | 0.017 |
| 956.0 | 0.017 |
| 955.0 | 0.016 |
| 954.0 | 0.017 |
| 953.0 | 0.02 |
| 952.0 | 0.019 |
| 951.0 | 0.017 |
| 950.0 | 0.017 |
| 949.0 | 0.018 |
| 948.0 | 0.015 |
| 947.0 | 0.018 |
| 946.0 | 0.017 |
| 945.0 | 0.02 |
| 944.0 | 0.018 |
| 943.0 | 0.017 |
| 942.0 | 0.016 |
| 941.0 | 0.018 |
| 940.0 | 0.015 |
| 939.0 | 0.019 |
| 938.0 | 0.017 |
| 937.0 | 0.015 |
| 936.0 | 0.016 |
| 935.0 | 0.015 |
| 934.0 | 0.016 |
| 933.0 | 0.018 |
| 932.0 | 0.018 |
| 931.0 | 0.018 |
| 930.0 | 0.019 |
| 929.0 | 0.016 |
| 928.0 | 0.018 |
| 927.0 | 0.017 |
| 926.0 | 0.017 |
| 925.0 | 0.018 |
| 924.0 | 0.018 |
| 923.0 | 0.017 |
| 922.0 | 0.016 |
| 921.0 | 0.019 |
| 920.0 | 0.018 |
| 919.0 | 0.018 |
| 918.0 | 0.017 |
| 917.0 | 0.02 |
| 916.0 | 0.018 |
| 915.0 | 0.019 |
| 914.0 | 0.019 |
| 913.0 | 0.021 |
| 912.0 | 0.016 |
| 911.0 | 0.017 |
| 910.0 | 0.018 |
| 909.0 | 0.019 |
| 908.0 | 0.017 |
| 907.0 | 0.017 |
| 906.0 | 0.019 |
| 905.0 | 0.018 |
| 904.0 | 0.019 |
| 903.0 | 0.019 |
| 902.0 | 0.021 |
| 901.0 | 0.018 |
| 900.0 | 0.02 |
| 899.0 | 0.019 |
| 898.0 | 0.019 |
| 897.0 | 0.019 |
| 896.0 | 0.021 |
| 895.0 | 0.021 |
| 894.0 | 0.018 |
| 893.0 | 0.018 |
| 892.0 | 0.018 |
| 891.0 | 0.019 |
| 890.0 | 0.02 |
| 889.0 | 0.017 |
| 888.0 | 0.018 |
| 887.0 | 0.02 |
| 886.0 | 0.02 |
| 885.0 | 0.017 |
| 884.0 | 0.015 |
| 883.0 | 0.017 |
| 882.0 | 0.019 |
| 881.0 | 0.019 |
| 880.0 | 0.016 |
| 879.0 | 0.02 |
| 878.0 | 0.019 |
| 877.0 | 0.019 |
| 876.0 | 0.018 |
| 875.0 | 0.017 |
| 874.0 | 0.015 |
| 873.0 | 0.018 |
| 872.0 | 0.018 |
| 871.0 | 0.02 |
| 870.0 | 0.019 |
| 869.0 | 0.02 |
| 868.0 | 0.018 |
| 867.0 | 0.018 |
| 866.0 | 0.019 |
| 865.0 | 0.015 |
| 864.0 | 0.017 |
| 863.0 | 0.019 |
| 862.0 | 0.019 |
| 861.0 | 0.02 |
| 860.0 | 0.019 |
| 859.0 | 0.02 |
| 858.0 | 0.019 |
| 857.0 | 0.015 |
| 856.0 | 0.017 |
| 855.0 | 0.019 |
| 854.0 | 0.019 |
| 853.0 | 0.018 |
| 852.0 | 0.019 |
| 851.0 | 0.017 |
| 850.0 | 0.018 |
| 849.0 | 0.019 |
| 848.0 | 0.018 |
| 847.0 | 0.016 |
| 846.0 | 0.018 |
| 845.0 | 0.018 |
| 844.0 | 0.018 |
| 843.0 | 0.018 |
| 842.0 | 0.016 |
| 841.0 | 0.018 |
| 840.0 | 0.016 |
| 839.0 | 0.018 |
| 838.0 | 0.02 |
| 837.0 | 0.016 |
| 836.0 | 0.02 |
| 835.0 | 0.017 |
| 834.0 | 0.02 |
| 833.0 | 0.018 |
| 832.0 | 0.016 |
| 831.0 | 0.018 |
| 830.0 | 0.018 |
| 829.0 | 0.017 |
| 828.0 | 0.018 |
| 827.0 | 0.017 |
| 826.0 | 0.017 |
| 825.0 | 0.017 |
| 824.0 | 0.019 |
| 823.0 | 0.019 |
| 822.0 | 0.018 |
| 821.0 | 0.019 |
| 820.0 | 0.018 |
| 819.0 | 0.017 |
| 818.0 | 0.019 |
| 817.0 | 0.017 |
| 816.0 | 0.017 |
| 815.0 | 0.018 |
| 814.0 | 0.018 |
| 813.0 | 0.017 |
| 812.0 | 0.017 |
| 811.0 | 0.018 |
| 810.0 | 0.018 |
| 809.0 | 0.018 |
| 808.0 | 0.019 |
| 807.0 | 0.019 |
| 806.0 | 0.018 |
| 805.0 | 0.019 |
| 804.0 | 0.018 |
| 803.0 | 0.015 |
| 802.0 | 0.014 |
| 801.0 | 0.018 |
| 800.0 | 0.018 |
| 799.0 | 0 |
| 798.0 | 0 |
| 797.0 | 0 |
| 796.0 | 0 |
| 795.0 | 0.001 |
| 794.0 | 0.002 |
| 793.0 | 0.003 |
| 792.0 | 0.004 |
| 791.0 | 0.003 |
| 790.0 | 0.003 |
| 789.0 | 0.001 |
| 788.0 | 0.001 |
| 787.0 | 0.001 |
| 786.0 | 0 |
| 785.0 | 0.001 |
| 784.0 | 0 |
| 783.0 | 0 |
| 782.0 | 0 |
| 781.0 | 0 |
| 780.0 | 0 |
| 779.0 | 0 |
| 778.0 | 0 |
| 777.0 | 0 |
| 776.0 | 0.001 |
| 775.0 | 0.001 |
| 774.0 | 0 |
| 773.0 | 0 |
| 772.0 | 0 |
| 771.0 | 0.001 |
| 770.0 | 0 |
| 769.0 | 0 |
| 768.0 | 0 |
| 767.0 | 0 |
| 766.0 | 0 |
| 765.0 | 0 |
| 764.0 | 0 |
| 763.0 | 0 |
| 762.0 | 0 |
| 761.0 | 0 |
| 760.0 | 0 |
| 759.0 | 0 |
| 758.0 | 0 |
| 757.0 | 0 |
| 756.0 | 0 |
| 755.0 | 0 |
| 754.0 | 0 |
| 753.0 | 0 |
| 752.0 | 0 |
| 751.0 | 0 |
| 750.0 | 0 |
| 749.0 | 0 |
| 748.0 | 0 |
| 747.0 | 0 |
| 746.0 | 0 |
| 745.0 | 0 |
| 744.0 | 0 |
| 743.0 | 0 |
| 742.0 | 0 |
| 741.0 | 0 |
| 740.0 | 0 |
| 739.0 | 0 |
| 738.0 | 0 |
| 737.0 | 0 |
| 736.0 | 0 |
| 735.0 | 0 |
| 734.0 | 0 |
| 733.0 | 0 |
| 732.0 | 0 |
| 731.0 | 0 |
| 730.0 | 0 |
| 729.0 | 0 |
| 728.0 | 0 |
| 727.0 | 0 |
| 726.0 | 0 |
| 725.0 | 0 |
| 724.0 | 0 |
| 723.0 | 0 |
| 722.0 | 0 |
| 721.0 | 0 |
| 720.0 | 0 |
| 719.0 | 0 |
| 718.0 | 0 |
| 717.0 | 0 |
| 716.0 | 0 |
| 715.0 | 0 |
| 714.0 | 0 |
| 713.0 | 0 |
| 712.0 | 0 |
| 711.0 | 0 |
| 710.0 | 0 |
| 709.0 | 0 |
| 708.0 | 0 |
| 707.0 | 0 |
| 706.0 | 0 |
| 705.0 | 0 |
| 704.0 | 0 |
| 703.0 | 0 |
| 702.0 | 0 |
| 701.0 | 0 |
| 700.0 | 0 |
| 699.0 | 0 |
| 698.0 | 0 |
| 697.0 | 0 |
| 696.0 | 0 |
| 695.0 | 0 |
| 694.0 | 0 |
| 693.0 | 0 |
| 692.0 | 0 |
| 691.0 | 0 |
| 690.0 | 0 |
| 689.0 | 0 |
| 688.0 | 0 |
| 687.0 | 0 |
| 686.0 | 0 |
| 685.0 | 0.001 |
| 684.0 | 0 |
| 683.0 | 0.001 |
| 682.0 | 0 |
| 681.0 | 0.001 |
| 680.0 | 0.001 |
| 679.0 | 0 |
| 678.0 | 0.001 |
| 677.0 | 0.001 |
| 676.0 | 0.001 |
| 675.0 | 0.001 |
| 674.0 | 0.001 |
| 673.0 | 0.001 |
| 672.0 | 0.001 |
| 671.0 | 0.001 |
| 670.0 | 0.001 |
| 669.0 | 0.001 |
| 668.0 | 0.001 |
| 667.0 | 0.001 |
| 666.0 | 0.002 |
| 665.0 | 0.002 |
| 664.0 | 0.002 |
| 663.0 | 0.002 |
| 662.0 | 0.003 |
| 661.0 | 0.003 |
| 660.0 | 0.004 |
| 659.0 | 0.005 |
| 658.0 | 0.006 |
| 657.0 | 0.007 |
| 656.0 | 0.008 |
| 655.0 | 0.01 |
| 654.0 | 0.013 |
| 653.0 | 0.016 |
| 652.0 | 0.021 |
| 651.0 | 0.027 |
| 650.0 | 0.036 |
| 649.0 | 0.049 |
| 648.0 | 0.069 |
| 647.0 | 0.098 |
| 646.0 | 0.145 |
| 645.0 | 0.223 |
| 644.0 | 0.357 |
| 643.0 | 0.602 |
| 642.0 | 1.082 |
| 641.0 | 2.1 |
| 640.0 | 4.426 |
| 639.0 | 10.06 |
| 638.0 | 22.303 |
| 637.0 | 41.518 |
| 636.0 | 60.093 |
| 635.0 | 69.228 |
| 634.0 | 70.799 |
| 633.0 | 70.96 |
| 632.0 | 71.789 |
| 631.0 | 72.185 |
| 630.0 | 71.129 |
| 629.0 | 67.366 |
| 628.0 | 58.001 |
| 627.0 | 41.954 |
| 626.0 | 24.307 |
| 625.0 | 11.631 |
| 624.0 | 5.114 |
| 623.0 | 2.295 |
| 622.0 | 1.117 |
| 621.0 | 0.583 |
| 620.0 | 0.324 |
| 619.0 | 0.191 |
| 618.0 | 0.117 |
| 617.0 | 0.076 |
| 616.0 | 0.05 |
| 615.0 | 0.034 |
| 614.0 | 0.024 |
| 613.0 | 0.017 |
| 612.0 | 0.013 |
| 611.0 | 0.009 |
| 610.0 | 0.007 |
| 609.0 | 0.005 |
| 608.0 | 0.004 |
| 607.0 | 0.003 |
| 606.0 | 0.003 |
| 605.0 | 0.002 |
| 604.0 | 0.002 |
| 603.0 | 0.001 |
| 602.0 | 0.001 |
| 601.0 | 0.001 |
| 600.0 | 0.001 |
| 599.0 | 0.001 |
| 598.0 | 0 |
| 597.0 | 0 |
| 596.0 | 0 |
| 595.0 | 0 |
| 594.0 | 0 |
| 593.0 | 0 |
| 592.0 | 0 |
| 591.0 | 0 |
| 590.0 | 0 |
| 589.0 | 0 |
| 588.0 | 0 |
| 587.0 | 0 |
| 586.0 | 0 |
| 585.0 | 0 |
| 584.0 | 0 |
| 583.0 | 0 |
| 582.0 | 0 |
| 581.0 | 0 |
| 580.0 | 0 |
| 579.0 | 0 |
| 578.0 | 0 |
| 577.0 | 0 |
| 576.0 | 0 |
| 575.0 | 0 |
| 574.0 | 0 |
| 573.0 | 0 |
| 572.0 | 0 |
| 571.0 | 0 |
| 570.0 | 0 |
| 569.0 | 0 |
| 568.0 | 0 |
| 567.0 | 0 |
| 566.0 | 0 |
| 565.0 | 0 |
| 564.0 | 0 |
| 563.0 | 0 |
| 562.0 | 0 |
| 561.0 | 0 |
| 560.0 | 0 |
| 559.0 | 0 |
| 558.0 | 0 |
| 557.0 | 0 |
| 556.0 | 0 |
| 555.0 | 0 |
| 554.0 | 0 |
| 553.0 | 0 |
| 552.0 | 0 |
| 551.0 | 0 |
| 550.0 | 0 |
| 549.0 | 0 |
| 548.0 | 0 |
| 547.0 | 0 |
| 546.0 | 0 |
| 545.0 | 0 |
| 544.0 | 0 |
| 543.0 | 0 |
| 542.0 | 0 |
| 541.0 | 0 |
| 540.0 | 0 |
| 539.0 | 0 |
| 538.0 | 0 |
| 537.0 | 0 |
| 536.0 | 0 |
| 535.0 | 0 |
| 534.0 | 0 |
| 533.0 | 0 |
| 532.0 | 0 |
| 531.0 | 0 |
| 530.0 | 0 |
| 529.0 | 0 |
| 528.0 | 0 |
| 527.0 | 0 |
| 526.0 | 0 |
| 525.0 | 0 |
| 524.0 | 0 |
| 523.0 | 0 |
| 522.0 | 0 |
| 521.0 | 0 |
| 520.0 | 0 |
| 519.0 | 0 |
| 518.0 | 0 |
| 517.0 | 0 |
| 516.0 | 0 |
| 515.0 | 0 |
| 514.0 | 0 |
| 513.0 | 0 |
| 512.0 | 0 |
| 511.0 | 0 |
| 510.0 | 0 |
| 509.0 | 0 |
| 508.0 | 0 |
| 507.0 | 0 |
| 506.0 | 0 |
| 505.0 | 0 |
| 504.0 | 0 |
| 503.0 | 0 |
| 502.0 | 0 |
| 501.0 | 0 |
| 500.0 | 0 |
| 499.0 | 0 |
| 498.0 | 0 |
| 497.0 | 0 |
| 496.0 | 0 |
| 495.0 | 0 |
| 494.0 | 0 |
| 493.0 | 0 |
| 492.0 | 0 |
| 491.0 | 0 |
| 490.0 | 0 |
| 489.0 | 0 |
| 488.0 | 0 |
| 487.0 | 0 |
| 486.0 | 0 |
| 485.0 | 0 |
| 484.0 | 0 |
| 483.0 | 0 |
| 482.0 | 0 |
| 481.0 | 0 |
| 480.0 | 0 |
| 479.0 | 0 |
| 478.0 | 0 |
| 477.0 | 0 |
| 476.0 | 0 |
| 475.0 | 0 |
| 474.0 | 0 |
| 473.0 | 0 |
| 472.0 | 0 |
| 471.0 | 0 |
| 470.0 | 0 |
| 469.0 | 0 |
| 468.0 | 0 |
| 467.0 | 0 |
| 466.0 | 0 |
| 465.0 | 0 |
| 464.0 | 0 |
| 463.0 | 0 |
| 462.0 | 0 |
| 461.0 | 0 |
| 460.0 | 0 |
| 459.0 | 0 |
| 458.0 | 0 |
| 457.0 | 0 |
| 456.0 | 0 |
| 455.0 | 0 |
| 454.0 | 0 |
| 453.0 | 0 |
| 452.0 | 0 |
| 451.0 | 0 |
| 450.0 | 0 |
| 449.0 | 0 |
| 448.0 | 0 |
| 447.0 | 0 |
| 446.0 | 0 |
| 445.0 | 0 |
| 444.0 | 0 |
| 443.0 | 0 |
| 442.0 | 0 |
| 441.0 | 0 |
| 440.0 | 0 |
| 439.0 | 0 |
| 438.0 | 0 |
| 437.0 | 0 |
| 436.0 | 0 |
| 435.0 | 0 |
| 434.0 | 0 |
| 433.0 | 0 |
| 432.0 | 0 |
| 431.0 | 0 |
| 430.0 | 0 |
| 429.0 | 0 |
| 428.0 | 0 |
| 427.0 | 0 |
| 426.0 | 0 |
| 425.0 | 0 |
| 424.0 | 0 |
| 423.0 | 0 |
| 422.0 | 0 |
| 421.0 | 0 |
| 420.0 | 0 |
| 419.0 | 0 |
| 418.0 | 0 |
| 417.0 | 0 |
| 416.0 | 0 |
| 415.0 | 0 |
| 414.0 | 0 |
| 413.0 | 0 |
| 412.0 | 0 |
| 411.0 | 0 |
| 410.0 | 0 |
| 409.0 | 0 |
| 408.0 | 0 |
| 407.0 | 0 |
| 406.0 | 0 |
| 405.0 | 0 |
| 404.0 | 0 |
| 403.0 | 0 |
| 402.0 | 0 |
| 401.0 | 0 |
| 400.0 | 0 |
| 399.0 | 0 |
| 398.0 | 0 |
| 397.0 | 0 |
| 396.0 | 0 |
| 395.0 | 0 |
| 394.0 | 0 |
| 393.0 | 0 |
| 392.0 | 0 |
| 391.0 | 0 |
| 390.0 | 0 |
| 389.0 | 0 |
| 388.0 | 0 |
| 387.0 | 0 |
| 386.0 | 0 |
| 385.0 | 0 |
| 384.0 | 0 |
| 383.0 | 0 |
| 382.0 | 0 |
| 381.0 | 0 |
| 380.0 | 0 |
| 379.0 | 0 |
| 378.0 | 0 |
| 377.0 | 0 |
| 376.0 | 0 |
| 375.0 | 0 |
| 374.0 | 0 |
| 373.0 | 0 |
| 372.0 | 0 |
| 371.0 | 0 |
| 370.0 | 0 |
| 369.0 | 0 |
| 368.0 | 0 |
| 367.0 | 0 |
| 366.0 | 0 |
| 365.0 | 0 |
| 364.0 | 0 |
| 363.0 | 0 |
| 362.0 | 0 |
| 361.0 | 0 |
| 360.0 | 0 |
| 359.0 | 0 |
| 358.0 | 0 |
| 357.0 | 0 |
| 356.0 | 0 |
| 355.0 | 0 |
| 354.0 | 0 |
| 353.0 | 0 |
| 352.0 | 0 |
| 351.0 | 0 |
| 350.0 | 0 |
| 349.0 | 0.001 |
| 348.0 | 0 |
| 347.0 | 0 |
| 346.0 | 0 |
| 345.0 | 0 |
| 344.0 | 0 |
| 343.0 | 0 |
| 342.0 | 0 |
| 341.0 | 0 |
| 340.0 | 0 |
| 339.0 | 0 |
| 338.0 | 0 |
| 337.0 | 0 |
| 336.0 | 0 |
| 335.0 | 0 |
| 334.0 | 0 |
| 333.0 | 0 |
| 332.0 | 0 |
| 331.0 | 0 |
| 330.0 | 0 |
| 329.0 | 0 |
| 328.0 | 0 |
| 327.0 | 0 |
| 326.0 | 0 |
| 325.0 | 0 |
| 324.0 | 0 |
| 323.0 | 0 |
| 322.0 | 0 |
| 321.0 | 0 |
| 320.0 | 0 |
| 319.0 | 0 |
| 318.0 | 0 |
| 317.0 | 0 |
| 316.0 | 0 |
| 315.0 | 0 |
| 314.0 | 0 |
| 313.0 | 0 |
| 312.0 | 0 |
| 311.0 | 0 |
| 310.0 | 0 |
| 309.0 | 0 |
| 308.0 | 0 |
| 307.0 | 0 |
| 306.0 | 0 |
| 305.0 | 0 |
| 304.0 | 0 |
| 303.0 | 0 |
| 302.0 | 0 |
| 301.0 | 0 |
| 300.0 | 0 |
| 299.0 | 0 |
| 298.0 | 0 |
| 297.0 | 0 |
| 296.0 | 0 |
| 295.0 | 0 |
| 294.0 | 0 |
| 293.0 | 0 |
| 292.0 | 0 |
| 291.0 | 0 |
| 290.0 | 0 |
| 289.0 | 0 |
| 288.0 | 0 |
| 287.0 | 0 |
| 286.0 | 0 |
| 285.0 | 0 |
| 284.0 | 0 |
| 283.0 | 0 |
| 282.0 | 0 |
| 281.0 | 0 |
| 280.0 | 0 |
| 279.0 | 0 |
| 278.0 | 0 |
| 277.0 | 0 |
| 276.0 | 0 |
| 275.0 | 0 |
| 274.0 | 0 |
| 273.0 | 0 |
| 272.0 | 0 |
| 271.0 | 0 |
| 270.0 | 0 |
| 269.0 | 0 |
| 268.0 | 0 |
| 267.0 | 0 |
| 266.0 | 0 |
| 265.0 | 0 |
| 264.0 | 0 |
| 263.0 | 0 |
| 262.0 | 0 |
| 261.0 | 0 |
| 260.0 | 0 |
| 259.0 | 0 |
| 258.0 | 0 |
| 257.0 | 0 |
| 256.0 | 0 |
| 255.0 | 0 |
| 254.0 | 0 |
| 253.0 | 0 |
| 252.0 | 0 |
| 251.0 | 0 |
| 250.0 | 0 |
| 249.0 | 0 |
| 248.0 | 0 |
| 247.0 | 0 |
| 246.0 | 0 |
| 245.0 | 0 |
| 244.0 | 0 |
| 243.0 | 0 |
| 242.0 | 0 |
| 241.0 | 0 |
| 240.0 | 0 |
| 239.0 | 0 |
| 238.0 | 0 |
| 237.0 | 0 |
| 236.0 | 0 |
| 235.0 | 0 |
| 234.0 | 0 |
| 233.0 | 0 |
| 232.0 | 0 |
| 231.0 | 0 |
| 230.0 | 0 |
| 229.0 | 0 |
| 228.0 | 0 |
| 227.0 | 0 |
| 226.0 | 0 |
| 225.0 | 0 |
| 224.0 | 0 |
| 223.0 | 0 |
| 222.0 | 0 |
| 221.0 | 0 |
| 220.0 | 0 |
| 219.0 | 0 |
| 218.0 | 0 |
| 217.0 | 0 |
| 216.0 | 0 |
| 215.0 | 0 |
| 214.0 | 0 |
| 213.0 | 0 |
| 212.0 | 0 |
| 211.0 | 0 |
| 210.0 | 0 |
| 209.0 | 0 |
| 208.0 | 0 |
| 207.0 | 0 |
| 206.0 | 0 |
| 205.0 | 0 |
| 204.0 | 0 |
| 203.0 | 0 |
| 202.0 | 0 |
| 201.0 | 0 |